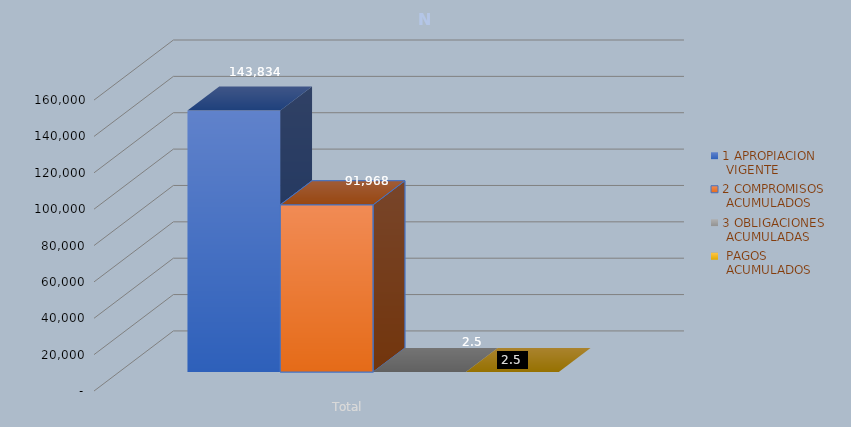
| Category | 1 APROPIACION
 VIGENTE | 2 COMPROMISOS
 ACUMULADOS | 3 OBLIGACIONES
 ACUMULADAS |  PAGOS
 ACUMULADOS |
|---|---|---|---|---|
| Total | 143833.689 | 91967.975 | 2.482 | 2.482 |